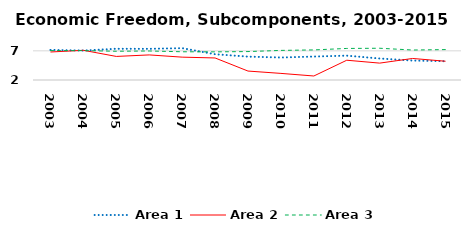
| Category | Area 1 | Area 2 | Area 3 |
|---|---|---|---|
| 2003.0 | 7.161 | 6.8 | 7.044 |
| 2004.0 | 7.049 | 7.091 | 7.044 |
| 2005.0 | 7.356 | 6.041 | 6.93 |
| 2006.0 | 7.342 | 6.299 | 6.976 |
| 2007.0 | 7.462 | 5.917 | 6.839 |
| 2008.0 | 6.421 | 5.779 | 6.825 |
| 2009.0 | 6.007 | 3.533 | 6.874 |
| 2010.0 | 5.856 | 3.132 | 7.074 |
| 2011.0 | 6.019 | 2.686 | 7.158 |
| 2012.0 | 6.179 | 5.39 | 7.409 |
| 2013.0 | 5.684 | 4.893 | 7.443 |
| 2014.0 | 5.334 | 5.692 | 7.139 |
| 2015.0 | 5.221 | 5.215 | 7.214 |